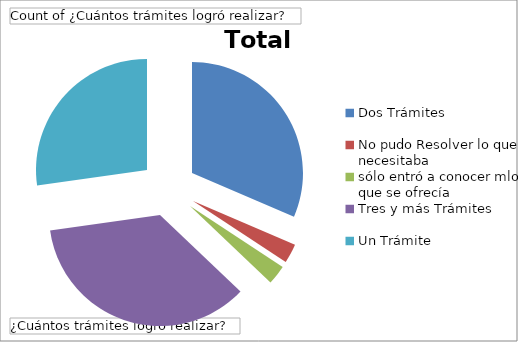
| Category | Total |
|---|---|
| Dos Trámites | 67 |
| No pudo Resolver lo que necesitaba | 6 |
| sólo entró a conocer mlo que se ofrecía | 6 |
| Tres y más Trámites | 76 |
| Un Trámite | 58 |